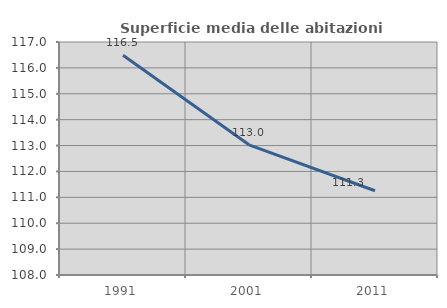
| Category | Superficie media delle abitazioni occupate |
|---|---|
| 1991.0 | 116.491 |
| 2001.0 | 113.029 |
| 2011.0 | 111.255 |